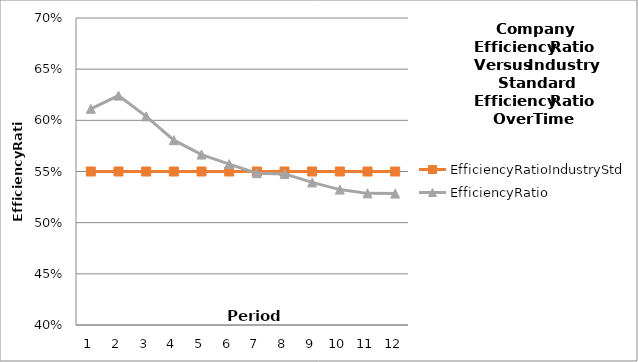
| Category | EfficiencyRatioIndustryStd | EfficiencyRatio |
|---|---|---|
| 0 | 0.55 | 0.611 |
| 1 | 0.55 | 0.624 |
| 2 | 0.55 | 0.604 |
| 3 | 0.55 | 0.581 |
| 4 | 0.55 | 0.567 |
| 5 | 0.55 | 0.557 |
| 6 | 0.55 | 0.548 |
| 7 | 0.55 | 0.548 |
| 8 | 0.55 | 0.539 |
| 9 | 0.55 | 0.532 |
| 10 | 0.55 | 0.529 |
| 11 | 0.55 | 0.528 |